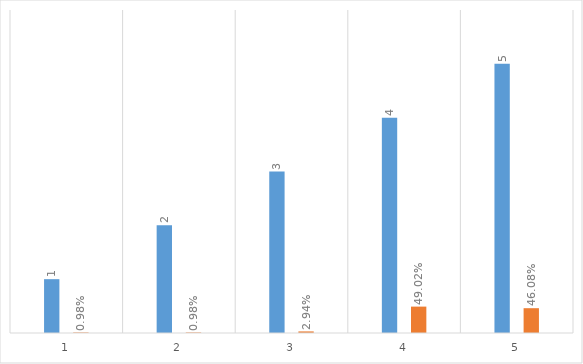
| Category | Series 0 | Series 1 |
|---|---|---|
| 0 | 1 | 0.01 |
| 1 | 2 | 0.01 |
| 2 | 3 | 0.029 |
| 3 | 4 | 0.49 |
| 4 | 5 | 0.461 |